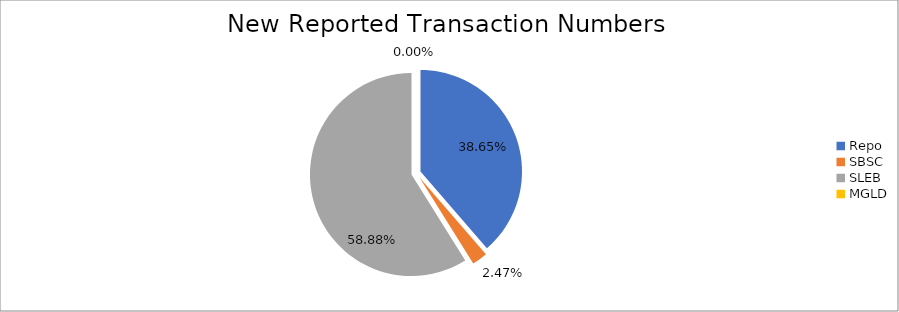
| Category | Series 0 |
|---|---|
| Repo | 414417 |
| SBSC | 26488 |
| SLEB | 631290 |
| MGLD | 30 |